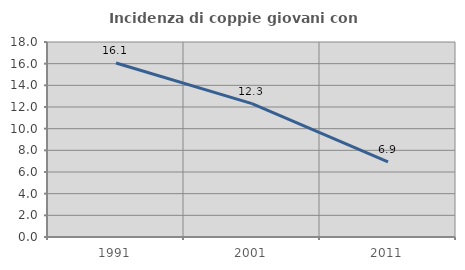
| Category | Incidenza di coppie giovani con figli |
|---|---|
| 1991.0 | 16.06 |
| 2001.0 | 12.308 |
| 2011.0 | 6.944 |